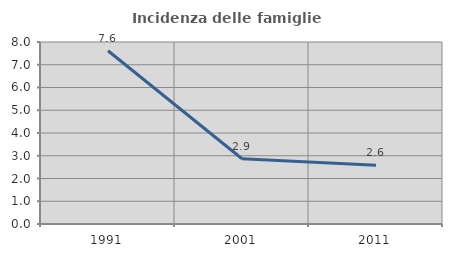
| Category | Incidenza delle famiglie numerose |
|---|---|
| 1991.0 | 7.617 |
| 2001.0 | 2.867 |
| 2011.0 | 2.58 |